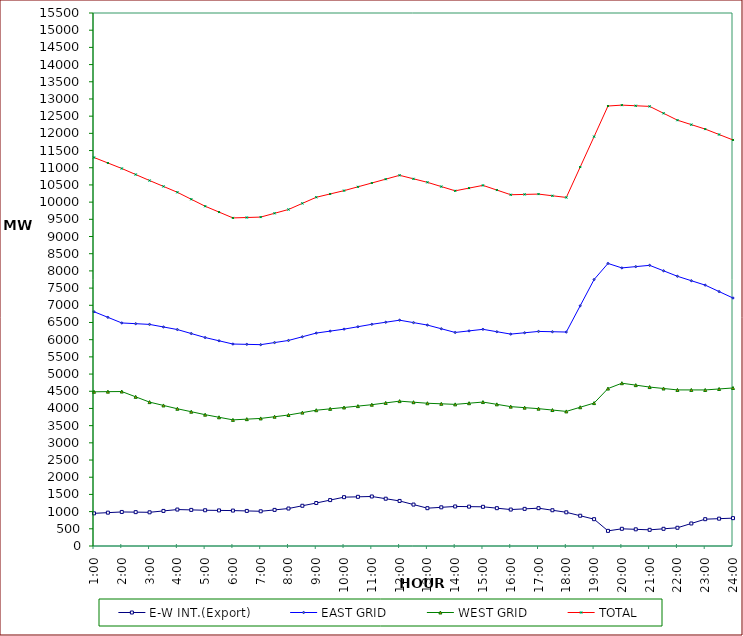
| Category | E-W INT.(Export) | EAST GRID | WEST GRID | TOTAL |
|---|---|---|---|---|
| 1:00 | 950 | 6813 | 4485 | 11298 |
| 1:30 | 970 | 6649.5 | 4488.5 | 11138 |
| 2:00 | 990 | 6486 | 4492 | 10978 |
| 2:30 | 985 | 6465 | 4338 | 10803 |
| 3:00 | 980 | 6444 | 4184 | 10628 |
| 3:30 | 1020 | 6369.5 | 4087.5 | 10457 |
| 4:00 | 1060 | 6295 | 3991 | 10286 |
| 4:30 | 1050 | 6178.5 | 3905 | 10083.5 |
| 5:00 | 1040 | 6062 | 3819 | 9881 |
| 5:30 | 1035 | 5967.5 | 3743.5 | 9711 |
| 6:00 | 1030 | 5873 | 3668 | 9541 |
| 6:30 | 1020 | 5864 | 3689 | 9553 |
| 7:00 | 1010 | 5855 | 3710 | 9565 |
| 7:30 | 1050 | 5916 | 3759.5 | 9675.5 |
| 8:00 | 1090 | 5977 | 3809 | 9786 |
| 8:30 | 1170 | 6084.5 | 3879 | 9963.5 |
| 9:00 | 1250 | 6192 | 3949 | 10141 |
| 9:30 | 1335 | 6249 | 3988.5 | 10237.5 |
| 10:00 | 1420 | 6306 | 4028 | 10334 |
| 10:30 | 1430 | 6376.5 | 4068.5 | 10445 |
| 11:00 | 1440 | 6447 | 4109 | 10556 |
| 11:30 | 1375 | 6507 | 4161 | 10668 |
| 12:00 | 1310 | 6567 | 4213 | 10780 |
| 12:30 | 1205 | 6496 | 4182 | 10678 |
| 13:00 | 1100 | 6425 | 4151 | 10576 |
| 13:30 | 1125 | 6317.5 | 4135 | 10452.5 |
| 14:00 | 1150 | 6210 | 4119 | 10329 |
| 14:30 | 1145 | 6255.5 | 4152.5 | 10408 |
| 15:00 | 1140 | 6301 | 4186 | 10487 |
| 15:30 | 1100 | 6231.5 | 4119.5 | 10351 |
| 16:00 | 1060 | 6162 | 4053 | 10215 |
| 16:30 | 1080 | 6201 | 4023.5 | 10224.5 |
| 17:00 | 1100 | 6240 | 3994 | 10234 |
| 17:30 | 1040 | 6231 | 3954 | 10185 |
| 18:00 | 980 | 6222 | 3914 | 10136 |
| 18:30 | 880 | 6985.5 | 4035 | 11020.5 |
| 19:00 | 780 | 7749 | 4156 | 11905 |
| 19:30 | 440 | 8217 | 4578 | 12795 |
| 20:00 | 500 | 8087 | 4734 | 12821 |
| 20:30 | 485 | 8124.5 | 4678 | 12802.5 |
| 21:00 | 470 | 8162 | 4622 | 12784 |
| 21:30 | 500 | 8003 | 4580.5 | 12583.5 |
| 22:00 | 530 | 7844 | 4539 | 12383 |
| 22:30 | 655 | 7715 | 4538.5 | 12253.5 |
| 23:00 | 780 | 7586 | 4538 | 12124 |
| 23:30 | 795 | 7399 | 4567 | 11966 |
| 24:00 | 810 | 7212 | 4596 | 11808 |